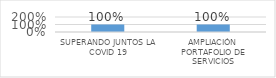
| Category | CUMPLIMIENTO |
|---|---|
| SUPERANDO JUNTOS LA COVID 19 | 1 |
| AMPLIACIÓN PORTAFOLIO DE SERVICIOS | 1 |